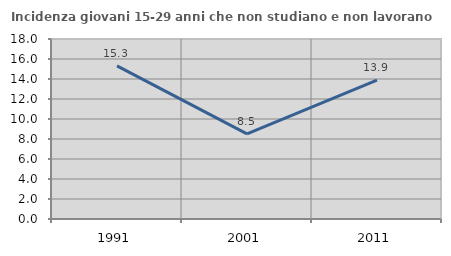
| Category | Incidenza giovani 15-29 anni che non studiano e non lavorano  |
|---|---|
| 1991.0 | 15.315 |
| 2001.0 | 8.519 |
| 2011.0 | 13.896 |